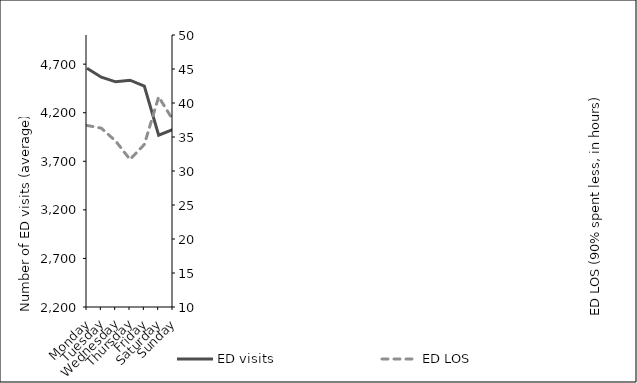
| Category | ED visits |
|---|---|
| Monday | 4658.423 |
| Tuesday | 4565.654 |
| Wednesday | 4518.192 |
| Thursday | 4534.788 |
| Friday | 4474.981 |
| Saturday | 3968.885 |
| Sunday | 4028.585 |